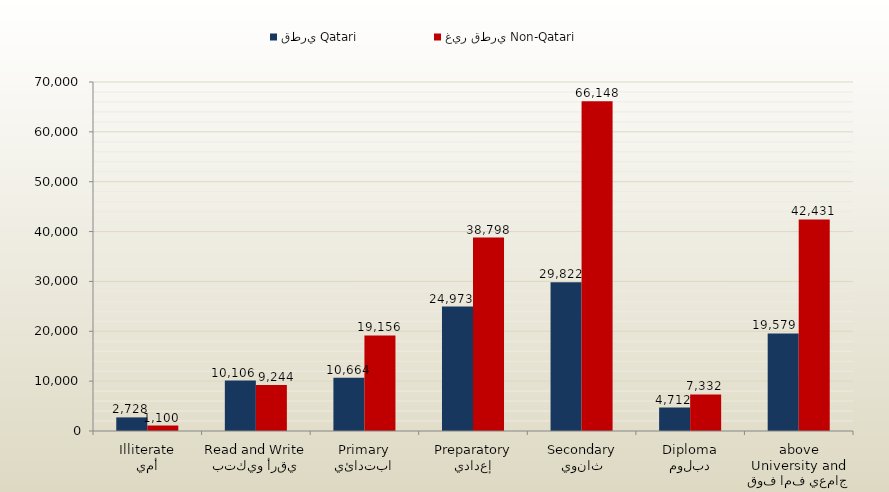
| Category | قطري Qatari | غير قطري Non-Qatari |
|---|---|---|
| أمي
Illiterate | 2728 | 1100 |
| يقرأ ويكتب
Read and Write | 10106 | 9244 |
| ابتدائي
Primary | 10664 | 19156 |
| إعدادي
Preparatory | 24973 | 38798 |
| ثانوي
Secondary | 29822 | 66148 |
| دبلوم
Diploma | 4712 | 7332 |
| جامعي فما فوق
University and above | 19579 | 42431 |